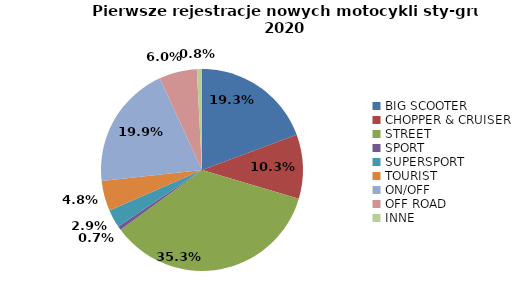
| Category | Series 0 |
|---|---|
| 0 | 4218 |
| 1 | 2242 |
| 2 | 7700 |
| 3 | 143 |
| 4 | 629 |
| 5 | 1047 |
| 6 | 4341 |
| 7 | 1316 |
| 8 | 179 |